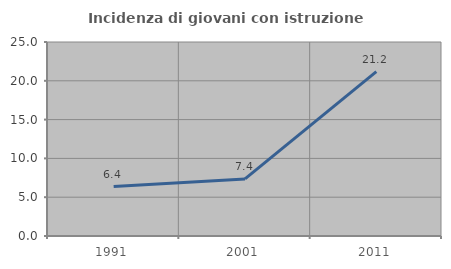
| Category | Incidenza di giovani con istruzione universitaria |
|---|---|
| 1991.0 | 6.369 |
| 2001.0 | 7.359 |
| 2011.0 | 21.182 |